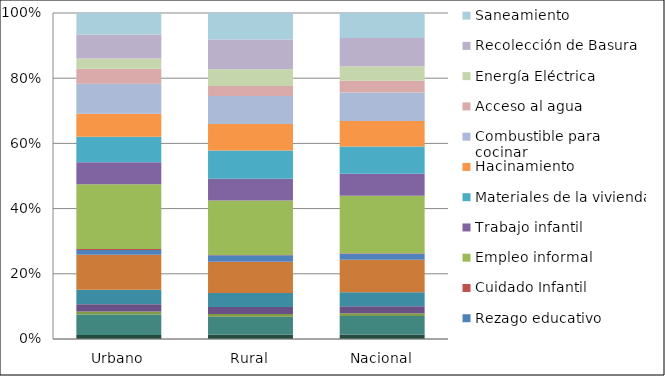
| Category | Acceso a servicios de salud | Seguridad alim. y nutr. | Embarazo en adolescentes | Cuidado prenatal | Asistencia escolar | Años de escolaridad | Rezago educativo | Cuidado Infantil | Empleo informal | Trabajo infantil | Materiales de la vivienda | Hacinamiento | Combustible para cocinar | Acceso al agua | Energía Eléctrica | Recolección de Basura | Saneamiento |
|---|---|---|---|---|---|---|---|---|---|---|---|---|---|---|---|---|---|
| Urbano | 1.213 | 6.271 | 0.922 | 2.263 | 4.413 | 10.73 | 1.489 | 0.306 | 19.896 | 6.732 | 7.806 | 7.084 | 9.137 | 4.648 | 3.115 | 7.413 | 6.56 |
| Rural | 1.402 | 5.433 | 0.844 | 2.103 | 4.295 | 9.604 | 1.984 | 0.123 | 16.67 | 6.719 | 8.646 | 8.1 | 8.639 | 3.078 | 5.091 | 9.132 | 8.137 |
| Nacional | 1.347 | 5.678 | 0.867 | 2.15 | 4.329 | 9.934 | 1.839 | 0.177 | 17.614 | 6.723 | 8.4 | 7.803 | 8.785 | 3.537 | 4.512 | 8.629 | 7.676 |